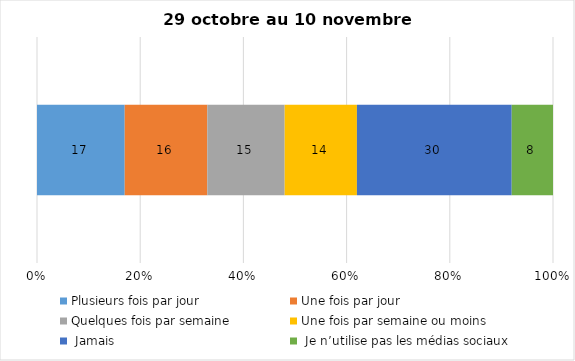
| Category | Plusieurs fois par jour | Une fois par jour | Quelques fois par semaine   | Une fois par semaine ou moins   |  Jamais   |  Je n’utilise pas les médias sociaux |
|---|---|---|---|---|---|---|
| 0 | 17 | 16 | 15 | 14 | 30 | 8 |